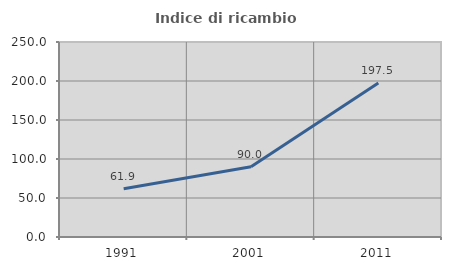
| Category | Indice di ricambio occupazionale  |
|---|---|
| 1991.0 | 61.864 |
| 2001.0 | 90.02 |
| 2011.0 | 197.507 |